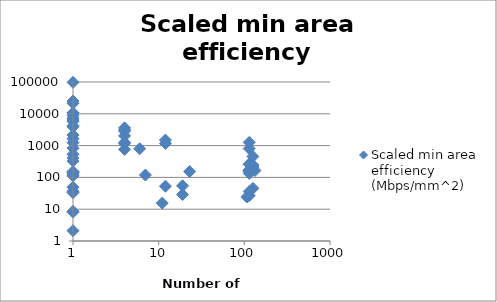
| Category | Scaled min area efficiency (Mbps/mm^2) |
|---|---|
| 107.0 | 24.233 |
| 114.0 | 1259.406 |
| 19.0 | 28.951 |
| 133.0 | 164.648 |
| 114.0 | 26.768 |
| 7.0 | 118.804 |
| 12.0 | 1169.73 |
| 114.0 | 163.636 |
| 114.0 | 35.901 |
| 11.0 | 15.54 |
| 12.0 | 52.786 |
| 1.0 | 2142.857 |
| 114.0 | 260.644 |
| 126.0 | 211.608 |
| 126.0 | 45.238 |
| 126.0 | 455.244 |
| 1.0 | 142.047 |
| 126.0 | 245.133 |
| 1.0 | 36.782 |
| 114.0 | 173.187 |
| 19.0 | 54.472 |
| 1.0 | 142.047 |
| 1.0 | 530.898 |
| 1.0 | 407.095 |
| 1.0 | 33.096 |
| 1.0 | 325.447 |
| 1.0 | 8.084 |
| 1.0 | 49.103 |
| 1.0 | 152.602 |
| 1.0 | 119.287 |
| 1.0 | 8.586 |
| 1.0 | 111.908 |
| 1.0 | 2.109 |
| 1.0 | 6387.713 |
| 1.0 | 3900.613 |
| 1.0 | 21457.671 |
| 1.0 | 97968.734 |
| 1.0 | 7317.855 |
| 1.0 | 10566.196 |
| 4.0 | 1160.39 |
| 4.0 | 2019.724 |
| 4.0 | 2859.118 |
| 4.0 | 3150.864 |
| 4.0 | 1258.772 |
| 4.0 | 761.281 |
| 1.0 | 25263.732 |
| 4.0 | 3615.107 |
| 1.0 | 10775.862 |
| 1.0 | 4184.1 |
| 114.0 | 133.519 |
| 12.0 | 1496.199 |
| 23.0 | 152.55 |
| 114.0 | 156.253 |
| 114.0 | 806.504 |
| 1.0 | 1234.405 |
| 1.0 | 1655.955 |
| 1.0 | 830 |
| 1.0 | 8912.096 |
| 1.0 | 5799.402 |
| 6.0 | 798 |
| 114.0 | 255.689 |
| 114.0 | 157.143 |